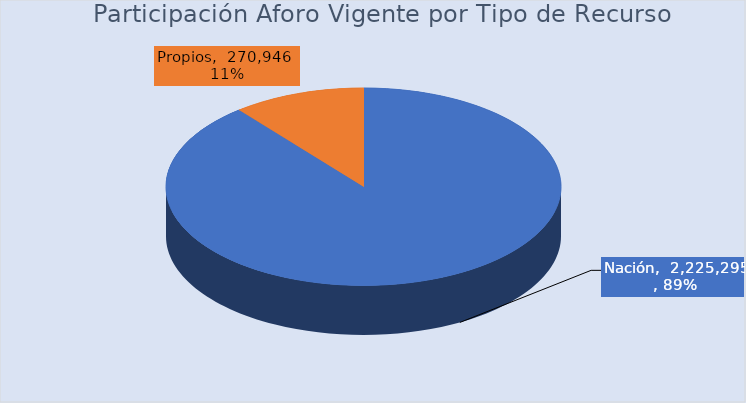
| Category | Total |
|---|---|
| Nación | 2225294.901 |
| Propios | 270945.743 |